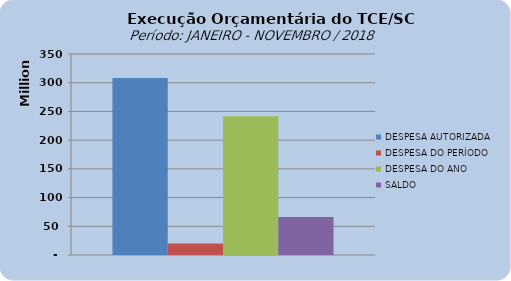
| Category | DESPESA AUTORIZADA | DESPESA DO PERÍODO | DESPESA DO ANO | SALDO |
|---|---|---|---|---|
| 0 | 308178075.12 | 19835369.5 | 241813416.53 | 66364658.59 |